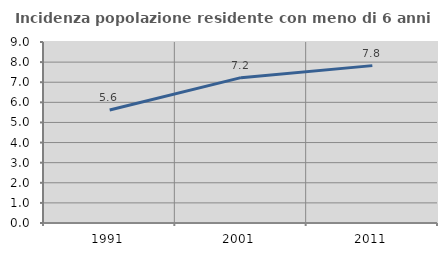
| Category | Incidenza popolazione residente con meno di 6 anni |
|---|---|
| 1991.0 | 5.616 |
| 2001.0 | 7.228 |
| 2011.0 | 7.825 |